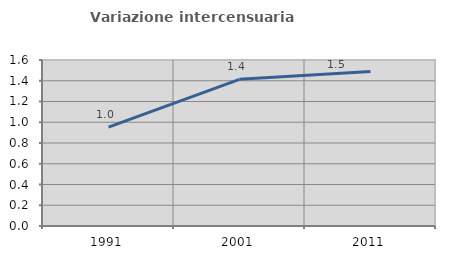
| Category | Variazione intercensuaria annua |
|---|---|
| 1991.0 | 0.952 |
| 2001.0 | 1.414 |
| 2011.0 | 1.489 |